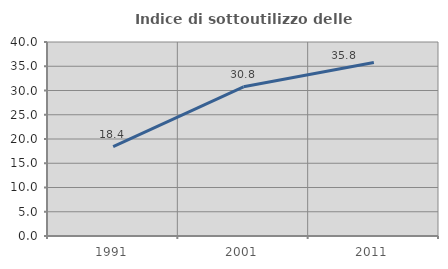
| Category | Indice di sottoutilizzo delle abitazioni  |
|---|---|
| 1991.0 | 18.421 |
| 2001.0 | 30.769 |
| 2011.0 | 35.756 |